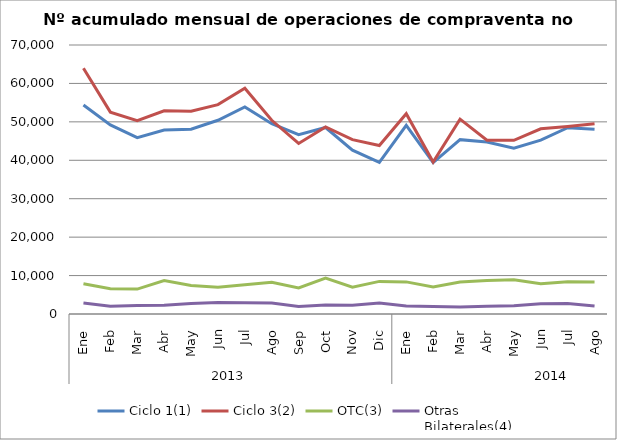
| Category | Ciclo 1(1) | Ciclo 3(2) | OTC(3) | Otras
Bilaterales(4) |
|---|---|---|---|---|
| 0 | 54386 | 63960 | 7873 | 2891 |
| 1 | 49196 | 52525 | 6550 | 2012 |
| 2 | 45892 | 50320 | 6475 | 2233 |
| 3 | 47876 | 52874 | 8686 | 2274 |
| 4 | 48091 | 52767 | 7394 | 2733 |
| 5 | 50415 | 54485 | 6994 | 3021 |
| 6 | 53879 | 58744 | 7586 | 2959 |
| 7 | 49504 | 50401 | 8243 | 2889 |
| 8 | 46688 | 44370 | 6784 | 1951 |
| 9 | 48531 | 48693 | 9357 | 2324 |
| 10 | 42642 | 45362 | 7000 | 2275 |
| 11 | 39447 | 43831 | 8487 | 2831 |
| 12 | 49087 | 52117 | 8357 | 2090 |
| 13 | 39397 | 39565 | 7045 | 1958 |
| 14 | 45373 | 50721 | 8313 | 1843 |
| 15 | 44744 | 45214 | 8739 | 2016 |
| 16 | 43118 | 45196 | 8896 | 2164 |
| 17 | 45225 | 48182 | 7881 | 2648 |
| 18 | 48478 | 48790 | 8413 | 2759 |
| 19 | 48087 | 49488 | 8324 | 2057 |